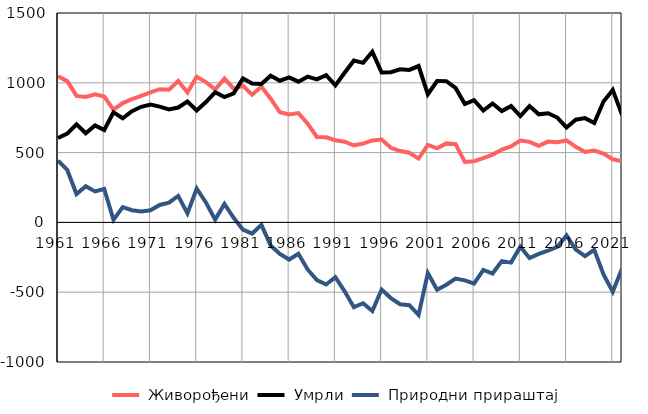
| Category |  Живорођени |  Умрли |  Природни прираштај |
|---|---|---|---|
| 1961.0 | 1047 | 605 | 442 |
| 1962.0 | 1012 | 636 | 376 |
| 1963.0 | 906 | 703 | 203 |
| 1964.0 | 898 | 639 | 259 |
| 1965.0 | 917 | 695 | 222 |
| 1966.0 | 901 | 662 | 239 |
| 1967.0 | 807 | 789 | 18 |
| 1968.0 | 855 | 746 | 109 |
| 1969.0 | 883 | 796 | 87 |
| 1970.0 | 907 | 828 | 79 |
| 1971.0 | 931 | 844 | 87 |
| 1972.0 | 954 | 829 | 125 |
| 1973.0 | 951 | 809 | 142 |
| 1974.0 | 1013 | 823 | 190 |
| 1975.0 | 930 | 866 | 64 |
| 1976.0 | 1044 | 802 | 242 |
| 1977.0 | 1005 | 862 | 143 |
| 1978.0 | 952 | 932 | 20 |
| 1979.0 | 1030 | 898 | 132 |
| 1980.0 | 958 | 925 | 33 |
| 1981.0 | 979 | 1031 | -52 |
| 1982.0 | 915 | 995 | -80 |
| 1983.0 | 973 | 991 | -18 |
| 1984.0 | 886 | 1051 | -165 |
| 1985.0 | 789 | 1015 | -226 |
| 1986.0 | 773 | 1039 | -266 |
| 1987.0 | 783 | 1008 | -225 |
| 1988.0 | 707 | 1044 | -337 |
| 1989.0 | 612 | 1025 | -413 |
| 1990.0 | 610 | 1055 | -445 |
| 1991.0 | 589 | 982 | -393 |
| 1992.0 | 578 | 1072 | -494 |
| 1993.0 | 552 | 1159 | -607 |
| 1994.0 | 564 | 1143 | -579 |
| 1995.0 | 587 | 1222 | -635 |
| 1996.0 | 593 | 1074 | -481 |
| 1997.0 | 534 | 1076 | -542 |
| 1998.0 | 511 | 1097 | -586 |
| 1999.0 | 499 | 1092 | -593 |
| 2000.0 | 457 | 1120 | -663 |
| 2001.0 | 555 | 918 | -363 |
| 2002.0 | 531 | 1013 | -482 |
| 2003.0 | 566 | 1012 | -446 |
| 2004.0 | 561 | 963 | -402 |
| 2005.0 | 433 | 848 | -415 |
| 2006.0 | 438 | 876 | -438 |
| 2007.0 | 461 | 801 | -340 |
| 2008.0 | 486 | 852 | -366 |
| 2009.0 | 521 | 798 | -277 |
| 2010.0 | 545 | 833 | -288 |
| 2011.0 | 586 | 761 | -175 |
| 2012.0 | 577 | 833 | -256 |
| 2013.0 | 548 | 774 | -226 |
| 2014.0 | 579 | 782 | -203 |
| 2015.0 | 575 | 751 | -176 |
| 2016.0 | 587 | 680 | -93 |
| 2017.0 | 541 | 736 | -195 |
| 2018.0 | 505 | 747 | -242 |
| 2019.0 | 515 | 712 | -197 |
| 2020.0 | 493 | 866 | -373 |
| 2021.0 | 452 | 949 | -497 |
| 2022.0 | 438 | 770 | -332 |